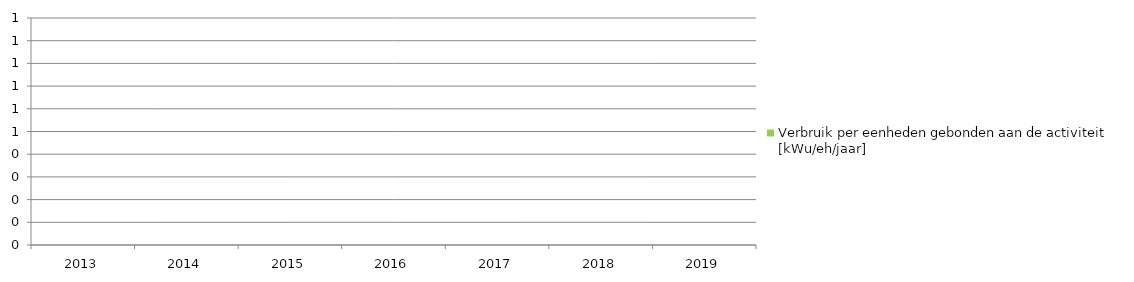
| Category | Verbruik per eenheden gebonden aan de activiteit [kWu/eh/jaar]

 |
|---|---|
| 2013.0 | 0 |
| 2014.0 | 0 |
| 2015.0 | 0 |
| 2016.0 | 0 |
| 2017.0 | 0 |
| 2018.0 | 0 |
| 2019.0 | 0 |